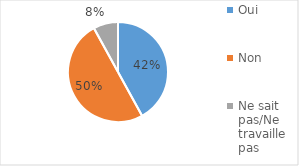
| Category | Series 0 |
|---|---|
| Oui | 0.42 |
| Non | 0.5 |
| Ne sait pas/Ne travaille pas | 0.08 |